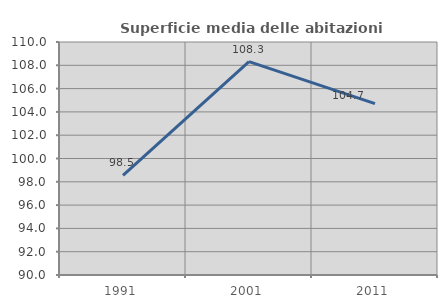
| Category | Superficie media delle abitazioni occupate |
|---|---|
| 1991.0 | 98.542 |
| 2001.0 | 108.313 |
| 2011.0 | 104.707 |